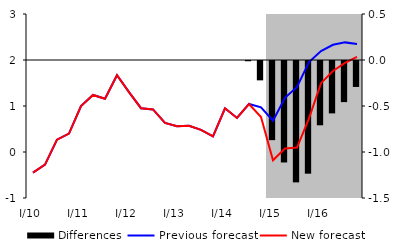
| Category | Differences |
|---|---|
| 0 | 0 |
| 1 | 0 |
| 2 | 0 |
| 3 | 0 |
| 4 | 0 |
| 5 | 0 |
| 6 | 0 |
| 7 | 0 |
| 8 | 0 |
| 9 | 0 |
| 10 | 0 |
| 11 | 0 |
| 12 | 0 |
| 13 | 0 |
| 14 | 0 |
| 15 | 0 |
| 16 | 0 |
| 17 | 0 |
| 18 | -0.003 |
| 19 | -0.21 |
| 20 | -0.86 |
| 21 | -1.103 |
| 22 | -1.319 |
| 23 | -1.225 |
| 24 | -0.699 |
| 25 | -0.569 |
| 26 | -0.447 |
| 27 | -0.282 |